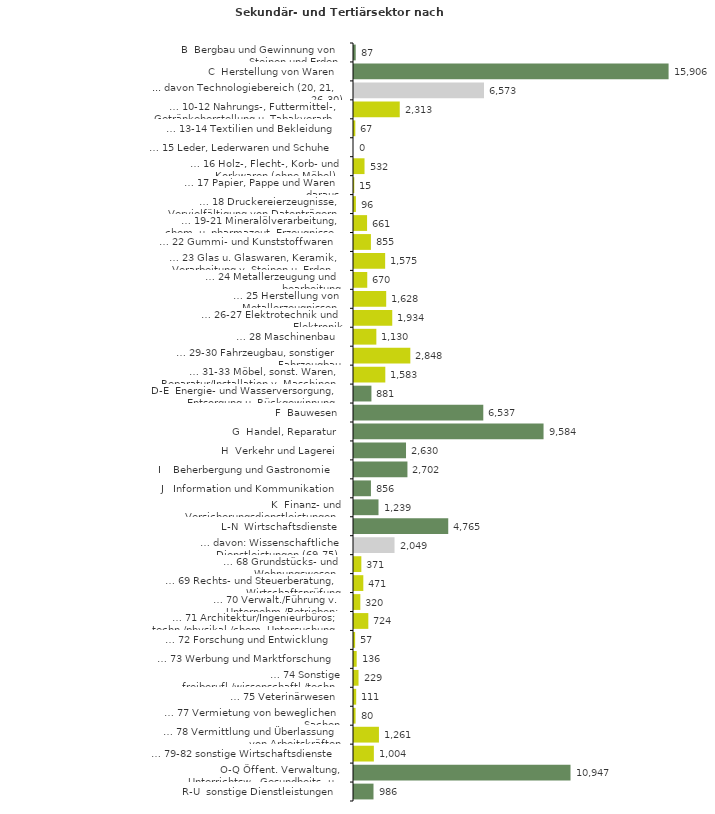
| Category | Series 0 |
|---|---|
| B  Bergbau und Gewinnung von Steinen und Erden | 87 |
| C  Herstellung von Waren | 15906 |
| ... davon Technologiebereich (20, 21, 26-30) | 6573 |
| … 10-12 Nahrungs-, Futtermittel-, Getränkeherstellung u. Tabakverarb. | 2313 |
| … 13-14 Textilien und Bekleidung | 67 |
| … 15 Leder, Lederwaren und Schuhe | 0 |
| … 16 Holz-, Flecht-, Korb- und Korkwaren (ohne Möbel)  | 532 |
| … 17 Papier, Pappe und Waren daraus  | 15 |
| … 18 Druckereierzeugnisse, Vervielfältigung von Datenträgern | 96 |
| … 19-21 Mineralölverarbeitung, chem. u. pharmazeut. Erzeugnisse | 661 |
| … 22 Gummi- und Kunststoffwaren | 855 |
| … 23 Glas u. Glaswaren, Keramik, Verarbeitung v. Steinen u. Erden  | 1575 |
| … 24 Metallerzeugung und -bearbeitung | 670 |
| … 25 Herstellung von Metallerzeugnissen  | 1628 |
| … 26-27 Elektrotechnik und Elektronik | 1934 |
| … 28 Maschinenbau | 1130 |
| … 29-30 Fahrzeugbau, sonstiger Fahrzeugbau | 2848 |
| … 31-33 Möbel, sonst. Waren, Reparatur/Installation v. Maschinen | 1583 |
| D-E  Energie- und Wasserversorgung, Entsorgung u. Rückgewinnung | 881 |
| F  Bauwesen | 6537 |
| G  Handel, Reparatur | 9584 |
| H  Verkehr und Lagerei | 2630 |
| I    Beherbergung und Gastronomie | 2702 |
| J   Information und Kommunikation | 856 |
| K  Finanz- und Versicherungsdienstleistungen | 1239 |
| L-N  Wirtschaftsdienste | 4765 |
| … davon: Wissenschaftliche Dienstleistungen (69-75) | 2049 |
| … 68 Grundstücks- und Wohnungswesen  | 371 |
| … 69 Rechts- und Steuerberatung, Wirtschaftsprüfung | 471 |
| … 70 Verwalt./Führung v. Unternehm./Betrieben; Unternehmensberat. | 320 |
| … 71 Architektur/Ingenieurbüros; techn./physikal./chem. Untersuchung | 724 |
| … 72 Forschung und Entwicklung  | 57 |
| … 73 Werbung und Marktforschung | 136 |
| … 74 Sonstige freiberufl./wissenschaftl./techn. Tätigkeiten | 229 |
| … 75 Veterinärwesen | 111 |
| … 77 Vermietung von beweglichen Sachen  | 80 |
| … 78 Vermittlung und Überlassung von Arbeitskräften | 1261 |
| … 79-82 sonstige Wirtschaftsdienste | 1004 |
| O-Q Öffent. Verwaltung, Unterrichtsw., Gesundheits- u. Sozialwesen | 10947 |
| R-U  sonstige Dienstleistungen | 986 |